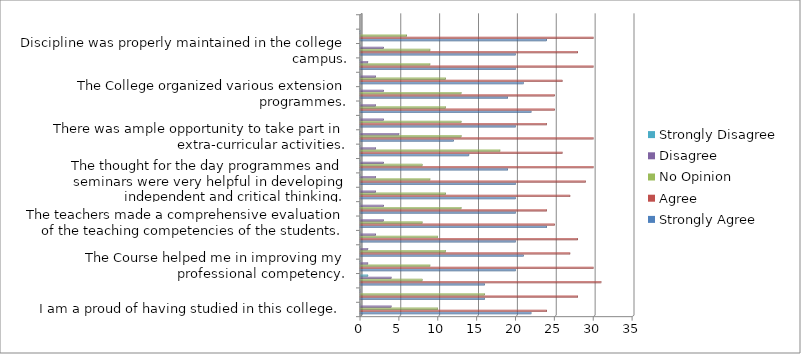
| Category | Strongly Agree  | Agree | No Opinion  | Disagree | Strongly Disagree  |
|---|---|---|---|---|---|
| I am a proud of having studied in this college. | 22 | 24 | 10 | 4 | 0 |
| There existed cordial relation between the staff and students.  | 16 | 28 | 16 | 0 | 0 |
| The institution helped me to fulfill my ambition of becoming a teacher. | 16 | 31 | 8 | 4 | 1 |
| The Course helped me in improving my professional competency. | 20 | 30 | 9 | 1 | 0 |
| The internal assessment of this college is balanced and objective. | 21 | 27 | 11 | 1 | 0 |
| The library facilities are adequate. | 20 | 28 | 10 | 2 | 0 |
| The teachers made a comprehensive evaluation of the teaching competencies of the students. | 24 | 25 | 8 | 3 | 0 |
| The teachers devoted extra time to render guidance. | 20 | 24 | 13 | 3 | 0 |
| Teacher adopted several innovative practices while teaching. | 20 | 27 | 11 | 2 | 0 |
| The thought for the day programmes and seminars were very helpful in developing independent and critical thinking. | 20 | 29 | 9 | 2 | 0 |
| The infrastructure facilities were adequate. | 19 | 30 | 8 | 3 | 0 |
| The educational tour proved to be informative. | 14 | 26 | 18 | 2 | 0 |
| There was ample opportunity to take part in extra-curricular activities. | 12 | 30 | 13 | 5 | 0 |
|  | 20 | 24 | 13 | 3 | 0 |
| There are adequate facilities for physical training and games. | 22 | 25 | 11 | 2 | 0 |
| The College organized various extension programmes. | 19 | 25 | 13 | 3 | 0 |
| The organization of various clubs in the college encouraged me to develop my intellectual and social skill. | 21 | 26 | 11 | 2 | 0 |
| Top Scores in the University Examination are felicitated. | 20 | 30 | 9 | 1 | 0 |
| Discipline was properly maintained in the college campus. | 20 | 28 | 9 | 3 | 0 |
| I often cherished glorious moments of my life in the college. | 24 | 30 | 6 | 0 | 0 |